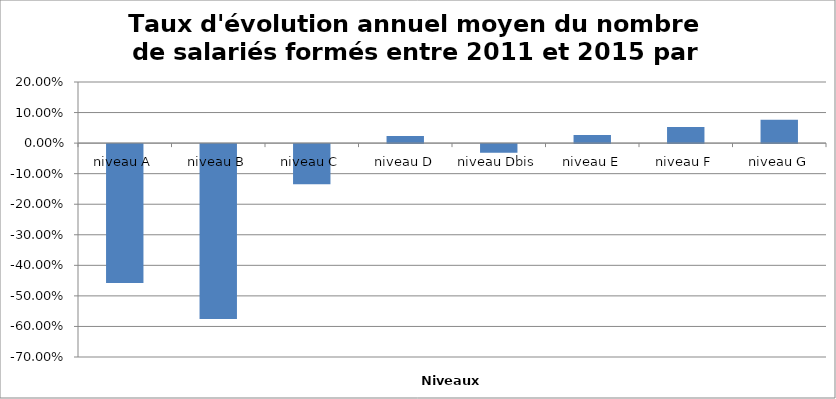
| Category | Series 0 |
|---|---|
| niveau A | -0.455 |
| niveau B | -0.573 |
| niveau C | -0.131 |
| niveau D | 0.024 |
| niveau Dbis | -0.029 |
| niveau E | 0.026 |
| niveau F | 0.053 |
| niveau G | 0.076 |